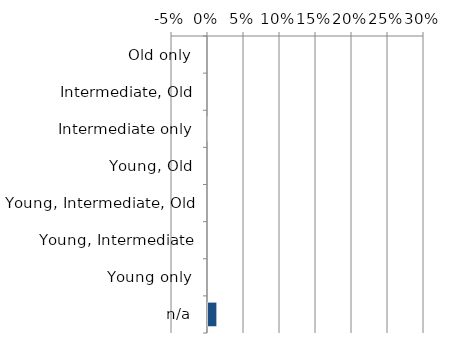
| Category | Not determinable |
|---|---|
| n/a | 0.012 |
| Young only | 0 |
| Young, Intermediate | 0 |
| Young, Intermediate, Old | 0 |
| Young, Old | 0 |
| Intermediate only | 0 |
| Intermediate, Old | 0 |
| Old only | 0 |